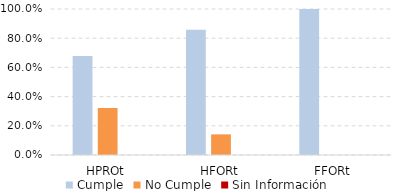
| Category | Cumple | No Cumple | Sin Información |
|---|---|---|---|
| HPROt | 0.679 | 0.321 | 0 |
| HFORt | 0.859 | 0.141 | 0 |
| FFORt | 1 | 0 | 0 |